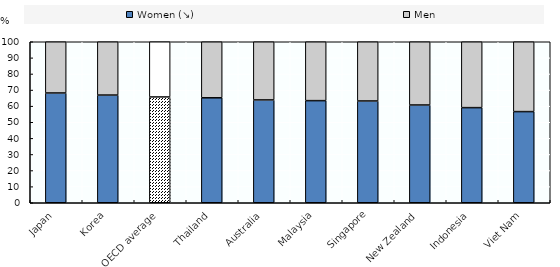
| Category | Women (↘) | Men |
|---|---|---|
| Japan | 68.181 | 31.819 |
| Korea | 66.894 | 33.106 |
| OECD average | 65.706 | 34.294 |
| Thailand | 65.188 | 34.812 |
| Australia | 63.864 | 36.136 |
| Malaysia | 63.424 | 36.576 |
| Singapore | 63.217 | 36.783 |
| New Zealand | 60.719 | 39.281 |
| Indonesia | 59.079 | 40.921 |
| Viet Nam | 56.613 | 43.387 |